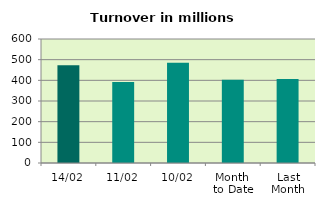
| Category | Series 0 |
|---|---|
| 14/02 | 473.479 |
| 11/02 | 391.739 |
| 10/02 | 484.897 |
| Month 
to Date | 403.135 |
| Last
Month | 406.741 |